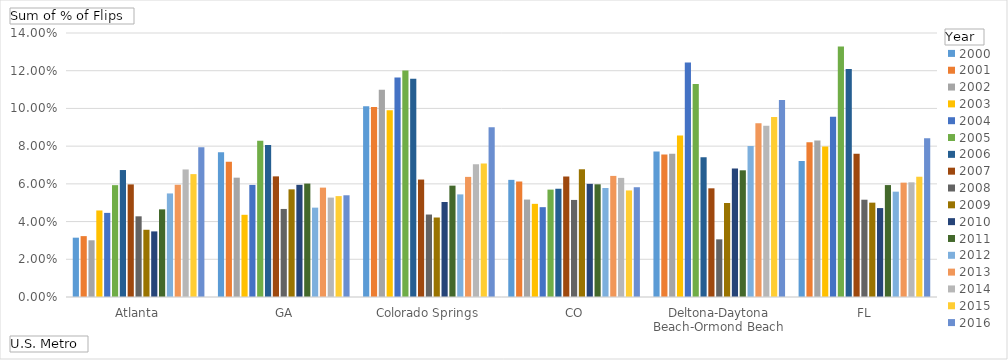
| Category | 2000 | 2001 | 2002 | 2003 | 2004 | 2005 | 2006 | 2007 | 2008 | 2009 | 2010 | 2011 | 2012 | 2013 | 2014 | 2015 | 2016 |
|---|---|---|---|---|---|---|---|---|---|---|---|---|---|---|---|---|---|
| Atlanta, GA | 0.031 | 0.032 | 0.03 | 0.046 | 0.045 | 0.059 | 0.067 | 0.06 | 0.043 | 0.036 | 0.035 | 0.046 | 0.055 | 0.06 | 0.068 | 0.065 | 0.079 |
| Colorado Springs, CO | 0.077 | 0.072 | 0.063 | 0.044 | 0.059 | 0.083 | 0.081 | 0.064 | 0.047 | 0.057 | 0.059 | 0.06 | 0.047 | 0.058 | 0.053 | 0.054 | 0.054 |
| Deltona-Daytona Beach-Ormond Beach, FL | 0.101 | 0.101 | 0.11 | 0.099 | 0.116 | 0.12 | 0.116 | 0.062 | 0.044 | 0.042 | 0.05 | 0.059 | 0.054 | 0.064 | 0.07 | 0.071 | 0.09 |
| Denver, CO | 0.062 | 0.061 | 0.052 | 0.049 | 0.048 | 0.057 | 0.057 | 0.064 | 0.051 | 0.068 | 0.06 | 0.06 | 0.058 | 0.064 | 0.063 | 0.057 | 0.058 |
| Las Vegas, NV | 0.077 | 0.076 | 0.076 | 0.086 | 0.124 | 0.113 | 0.074 | 0.058 | 0.031 | 0.05 | 0.068 | 0.067 | 0.08 | 0.092 | 0.091 | 0.096 | 0.105 |
| Tampa-St. Petersburg, FL | 0.072 | 0.082 | 0.083 | 0.08 | 0.096 | 0.133 | 0.121 | 0.076 | 0.052 | 0.05 | 0.047 | 0.059 | 0.056 | 0.061 | 0.061 | 0.064 | 0.084 |